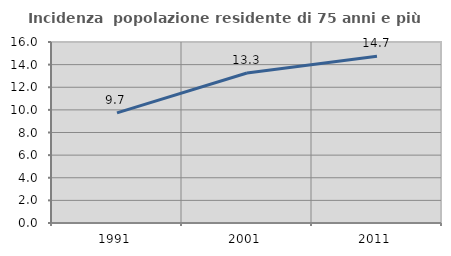
| Category | Incidenza  popolazione residente di 75 anni e più |
|---|---|
| 1991.0 | 9.732 |
| 2001.0 | 13.259 |
| 2011.0 | 14.74 |